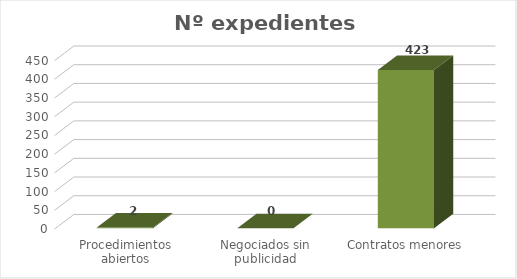
| Category | Series 0 |
|---|---|
| Procedimientos abiertos | 2 |
| Negociados sin publicidad | 0 |
| Contratos menores | 423 |